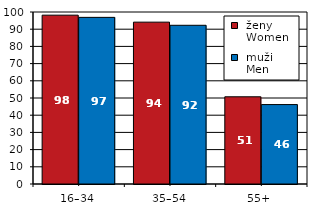
| Category |  ženy 
 Women |  muži 
 Men |
|---|---|---|
| 16–34 | 98.16 | 96.883 |
| 35–54 | 94.096 | 92.272 |
| 55+  | 50.702 | 46.177 |